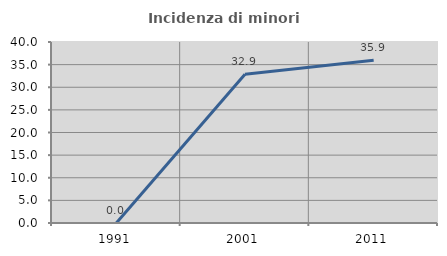
| Category | Incidenza di minori stranieri |
|---|---|
| 1991.0 | 0 |
| 2001.0 | 32.857 |
| 2011.0 | 35.948 |